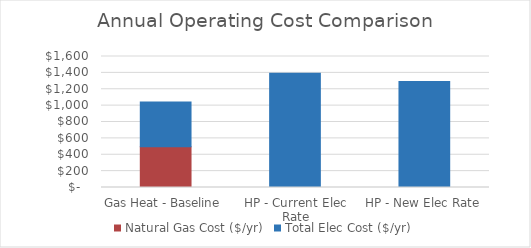
| Category | Natural Gas Cost ($/yr) | Total Elec Cost ($/yr) |
|---|---|---|
| Gas Heat - Baseline | 496.42 | 546.524 |
| HP - Current Elec Rate | 0 | 1395.705 |
| HP - New Elec Rate | 0 | 1295.487 |